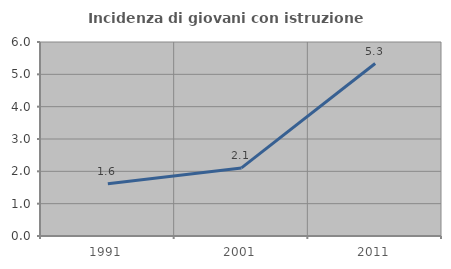
| Category | Incidenza di giovani con istruzione universitaria |
|---|---|
| 1991.0 | 1.613 |
| 2001.0 | 2.105 |
| 2011.0 | 5.333 |